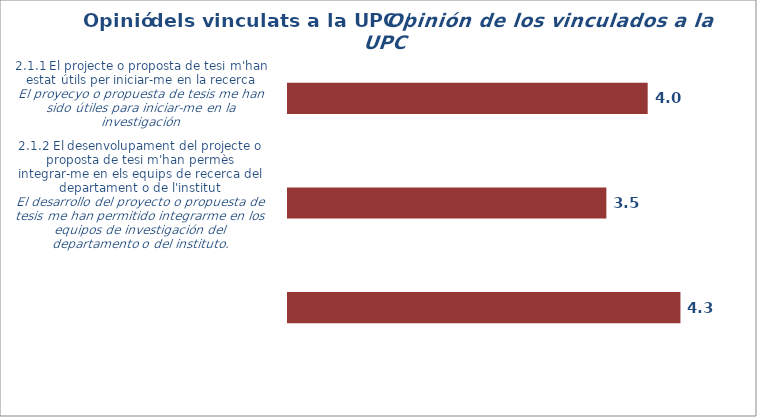
| Category | Mitjana |
|---|---|
| 1.0 | 3.97 |
| 2.0 | 3.514 |
| 3.0 | 4.332 |